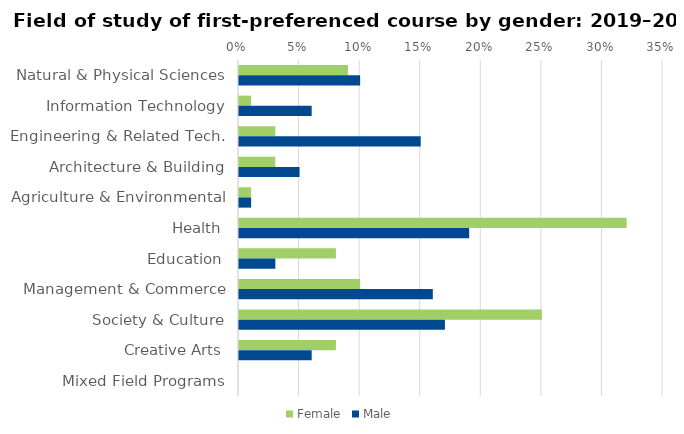
| Category | Female | Male |
|---|---|---|
| Natural & Physical Sciences | 0.09 | 0.1 |
| Information Technology | 0.01 | 0.06 |
| Engineering & Related Tech. | 0.03 | 0.15 |
| Architecture & Building | 0.03 | 0.05 |
| Agriculture & Environmental | 0.01 | 0.01 |
| Health | 0.32 | 0.19 |
| Education | 0.08 | 0.03 |
| Management & Commerce | 0.1 | 0.16 |
| Society & Culture | 0.25 | 0.17 |
| Creative Arts | 0.08 | 0.06 |
| Mixed Field Programs | 0 | 0 |